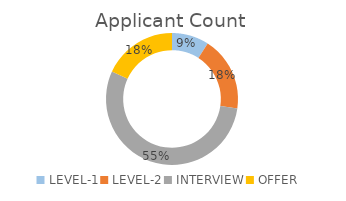
| Category | Applicant Count |
|---|---|
| LEVEL-1 | 1 |
| LEVEL-2 | 2 |
| INTERVIEW | 6 |
| OFFER | 2 |